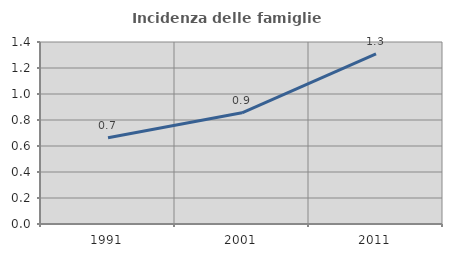
| Category | Incidenza delle famiglie numerose |
|---|---|
| 1991.0 | 0.664 |
| 2001.0 | 0.855 |
| 2011.0 | 1.308 |